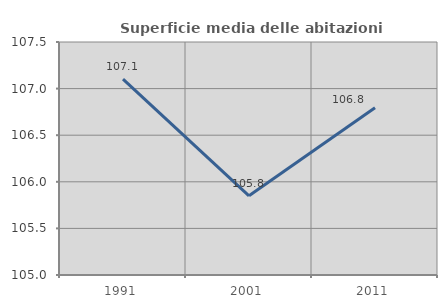
| Category | Superficie media delle abitazioni occupate |
|---|---|
| 1991.0 | 107.102 |
| 2001.0 | 105.85 |
| 2011.0 | 106.796 |